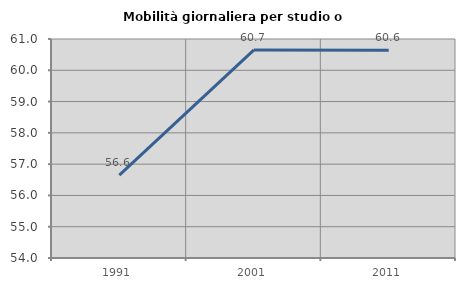
| Category | Mobilità giornaliera per studio o lavoro |
|---|---|
| 1991.0 | 56.647 |
| 2001.0 | 60.652 |
| 2011.0 | 60.637 |